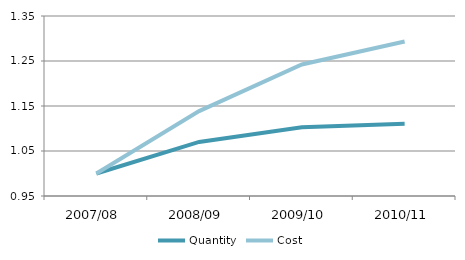
| Category | Quantity | Cost |
|---|---|---|
| 2007/08 | 1 | 1 |
| 2008/09 | 1.07 | 1.139 |
| 2009/10 | 1.103 | 1.242 |
| 2010/11 | 1.111 | 1.293 |